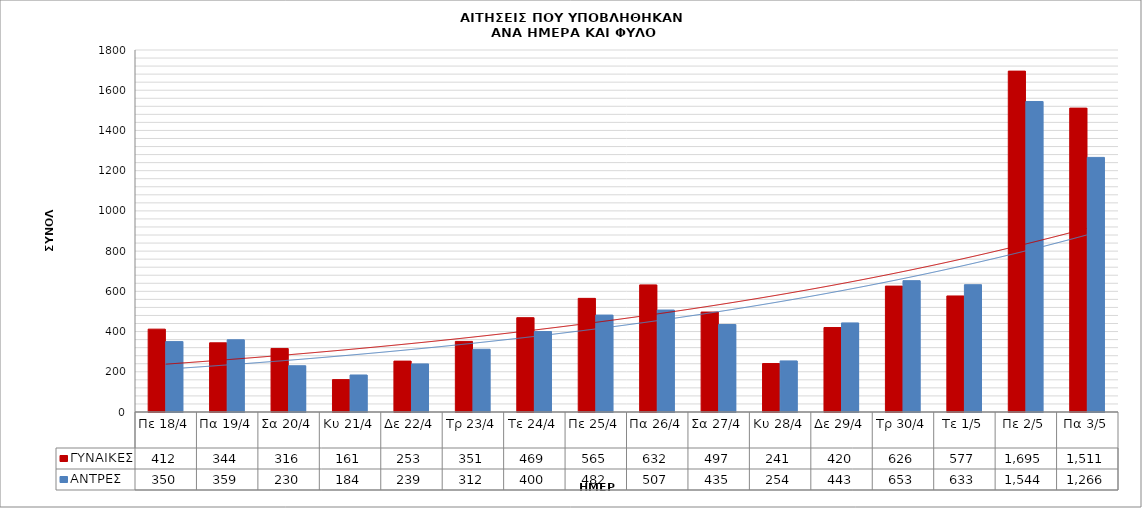
| Category | ΓΥΝΑΙΚΕΣ | ΑΝΤΡΕΣ |
|---|---|---|
| Πε 18/4 | 412 | 350 |
| Πα 19/4 | 344 | 359 |
| Σα 20/4 | 316 | 230 |
| Κυ 21/4 | 161 | 184 |
| Δε 22/4 | 253 | 239 |
| Τρ 23/4 | 351 | 312 |
| Τε 24/4 | 469 | 400 |
| Πε 25/4 | 565 | 482 |
| Πα 26/4 | 632 | 507 |
| Σα 27/4 | 497 | 435 |
| Κυ 28/4 | 241 | 254 |
| Δε 29/4 | 420 | 443 |
| Τρ 30/4 | 626 | 653 |
| Τε 1/5 | 577 | 633 |
| Πε 2/5 | 1695 | 1544 |
| Πα 3/5 | 1511 | 1266 |